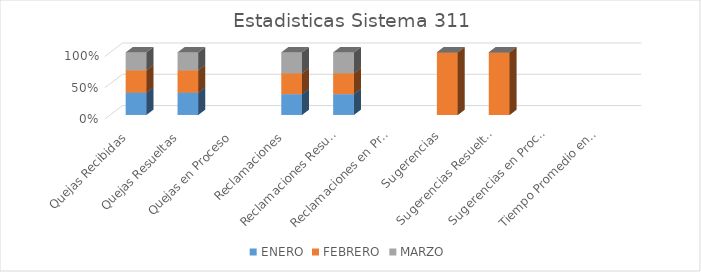
| Category | ENERO | FEBRERO | MARZO |
|---|---|---|---|
| Quejas Recibidas | 10 | 10 | 8 |
| Quejas Resueltas | 10 | 10 | 8 |
| Quejas en Proceso | 0 | 0 | 0 |
| Reclamaciones | 1 | 1 | 1 |
| Reclamaciones Resueltas | 1 | 1 | 1 |
| Reclamaciones en Proceso | 0 | 0 | 0 |
| Sugerencias | 0 | 5 | 0 |
| Sugerencias Resueltas | 0 | 5 | 0 |
| Sugerencias en Proceso | 0 | 0 | 0 |
| Tiempo Promedio en que fueron Respondidas | 0 | 0 | 0 |